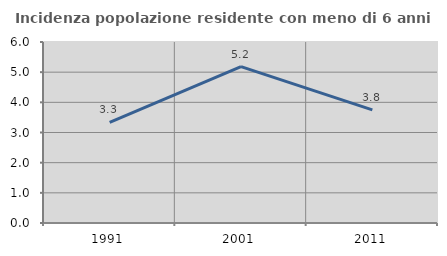
| Category | Incidenza popolazione residente con meno di 6 anni |
|---|---|
| 1991.0 | 3.333 |
| 2001.0 | 5.185 |
| 2011.0 | 3.75 |